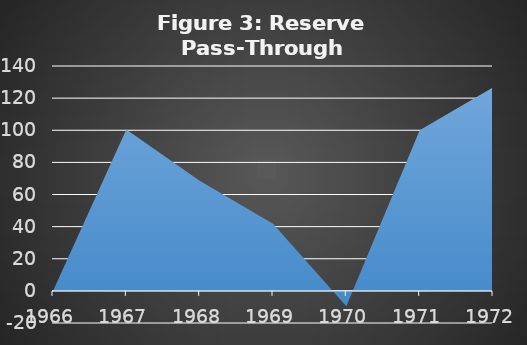
| Category | Series 0 |
|---|---|
| 1966.0 | 0 |
| 1967.0 | 100.465 |
| 1968.0 | 68.484 |
| 1969.0 | 41.794 |
| 1970.0 | -9.57 |
| 1971.0 | 100.019 |
| 1972.0 | 126.731 |